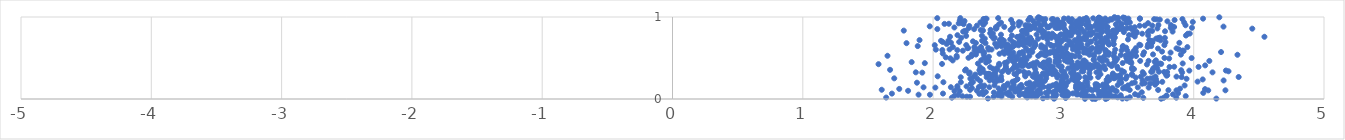
| Category | Series 0 |
|---|---|
| 2.0127929077230045 | 0.657 |
| 2.9386549026233486 | 0.936 |
| 3.026079686418259 | 0.651 |
| 2.9523061924115086 | 0.284 |
| 3.2092926473187156 | 0.783 |
| 1.8354660817791066 | 0.45 |
| 2.9609176681823945 | 0.935 |
| 2.523331696348404 | 0.643 |
| 3.7957012960414556 | 0.329 |
| 3.2008311019266666 | 0.862 |
| 3.321542800486911 | 0.907 |
| 3.152049557840236 | 0.375 |
| 3.308803528072011 | 0.147 |
| 3.482856235314981 | 0.503 |
| 2.524935309373221 | 0.03 |
| 3.172806579868607 | 0.908 |
| 1.6839511220435608 | 0.066 |
| 3.414521443923875 | 0.872 |
| 2.6899993165600997 | 0.81 |
| 3.8800163318312615 | 0.07 |
| 3.1773178096635366 | 0.757 |
| 3.057206967437389 | 0.948 |
| 3.139957605715839 | 0.337 |
| 2.797200789410815 | 0.271 |
| 3.8949638027954285 | 0.126 |
| 3.715497859279122 | 0.971 |
| 3.3870159785690137 | 0.835 |
| 3.3263404394778444 | 0.543 |
| 3.225321784833388 | 0.035 |
| 4.120011501042579 | 0.464 |
| 3.01048862924758 | 0.473 |
| 2.9903450313468576 | 0.051 |
| 3.094933547255815 | 0.905 |
| 2.612727014641468 | 0.875 |
| 3.0945533523039144 | 0.63 |
| 3.4783368550916207 | 0.529 |
| 3.8059823671989417 | 0.108 |
| 3.1302967791101044 | 0.42 |
| 2.83079885424495 | 0.407 |
| 3.178796313748708 | 0.102 |
| 3.8144703713044783 | 0.39 |
| 3.436164389074875 | 0.855 |
| 2.8607818862976644 | 0.629 |
| 3.8116525619852593 | 0.494 |
| 2.7310470094807657 | 0.962 |
| 3.0073635838078037 | 0.51 |
| 2.6093645686440805 | 0.211 |
| 3.624181347336291 | 0.896 |
| 2.5824134226299273 | 0.082 |
| 3.230335264854377 | 0.39 |
| 2.750154674530581 | 0.101 |
| 2.514383526284392 | 0.678 |
| 4.335910965760808 | 0.539 |
| 2.4819055617339045 | 0.858 |
| 3.7292416268291126 | 0.902 |
| 3.115540294431222 | 0.567 |
| 3.9386344331656993 | 0.035 |
| 3.7729351694642426 | 0.329 |
| 2.5801678002385597 | 0.049 |
| 3.124640808166241 | 0.973 |
| 3.417825649316733 | 0.37 |
| 3.9303543962726937 | 0.165 |
| 3.097894585749092 | 0.402 |
| 2.547732741983034 | 0.669 |
| 2.9905952469985415 | 0.141 |
| 2.9578361485748563 | 0.587 |
| 2.276204821079821 | 0.31 |
| 3.849816846805129 | 0.878 |
| 2.75316541027573 | 0.42 |
| 2.9193610782327206 | 0.167 |
| 2.966867575355259 | 0.459 |
| 3.5827959985270033 | 0.662 |
| 3.915584397637178 | 0.434 |
| 3.1328048959891106 | 0.143 |
| 3.7051093437399327 | 0.393 |
| 2.437555538804054 | 0.388 |
| 2.776435331257525 | 0.39 |
| 2.373103196045608 | 0.602 |
| 2.772438722104821 | 0.626 |
| 2.7390426755153454 | 0.895 |
| 3.3219617831241153 | 0.098 |
| 2.1298942536922674 | 0.759 |
| 4.073540130124088 | 0.074 |
| 3.650527387963572 | 0.777 |
| 3.325301494832162 | 0.162 |
| 3.6829255787204356 | 0.694 |
| 2.5038251079841833 | 0.909 |
| 3.6809196208521047 | 0.709 |
| 3.4430559051152865 | 0.863 |
| 3.2817767411909426 | 0.696 |
| 3.4136919969418407 | 0.838 |
| 3.3748205256918746 | 0.779 |
| 2.318443214542111 | 0.591 |
| 2.990975592631945 | 0.529 |
| 4.449636932147669 | 0.858 |
| 2.3439422177804716 | 0.432 |
| 2.336398540622145 | 0.101 |
| 2.5853935785752586 | 0.58 |
| 2.9840735646736807 | 0.715 |
| 3.088935112284073 | 0.521 |
| 3.525956571252985 | 0.304 |
| 2.4645556543721967 | 0.736 |
| 2.7704871718040156 | 0.892 |
| 4.209925339874239 | 0.573 |
| 3.587232037499757 | 0.983 |
| 3.346783353194071 | 0.563 |
| 2.908990424297952 | 0.649 |
| 3.0680109146148205 | 0.854 |
| 2.4111383054961797 | 0.266 |
| 1.8959426762280422 | 0.718 |
| 3.2866052154218592 | 0.841 |
| 3.5496077071442067 | 0.058 |
| 2.1442872707979026 | 0.016 |
| 2.5431475554294916 | 0.712 |
| 3.111449752990449 | 0.057 |
| 2.624904195608859 | 0.472 |
| 3.4427496961653663 | 0.898 |
| 2.7465282629372068 | 0.132 |
| 2.8506955902441677 | 0.945 |
| 3.084228156184976 | 0.298 |
| 2.948341575659798 | 0.664 |
| 2.809568952761372 | 0.997 |
| 3.1997193731167126 | 0.315 |
| 3.4576417435465614 | 0.646 |
| 2.5987994547145945 | 0.964 |
| 3.337718125213804 | 0.01 |
| 2.6488226582971626 | 0.12 |
| 2.984262205377161 | 0.177 |
| 3.163266362373824 | 0.067 |
| 3.1085816823527512 | 0.577 |
| 3.3860788879489014 | 0.669 |
| 2.7759575218620354 | 0.403 |
| 2.802271876086898 | 0.985 |
| 2.4724084441765957 | 0.747 |
| 2.551163462546312 | 0.441 |
| 2.1999503251045587 | 0.696 |
| 2.6947066050959245 | 0.828 |
| 3.1187962037230763 | 0.876 |
| 3.5169491569714193 | 0.457 |
| 3.0177214164501387 | 0.615 |
| 3.483852626853445 | 0.925 |
| 3.72124730576842 | 0.86 |
| 2.186195852542439 | 0.157 |
| 3.1370544152193376 | 0.854 |
| 3.0646731666563314 | 0.239 |
| 3.5749261166274433 | 0.045 |
| 3.0191123386543697 | 0.483 |
| 2.864138078507911 | 0.075 |
| 2.5214700671083663 | 0.09 |
| 3.232382956195235 | 0.54 |
| 2.7666408291746456 | 0.415 |
| 2.7421045410981315 | 0.988 |
| 2.857371253165193 | 0.22 |
| 3.206793129237009 | 0.699 |
| 3.0758721452912847 | 0.854 |
| 2.543179756033295 | 0.158 |
| 3.298303554134542 | 0.886 |
| 3.1286615151663804 | 0.647 |
| 2.9549793692555304 | 0.156 |
| 3.903886722866801 | 0.351 |
| 2.118045623164625 | 0.713 |
| 2.486410413512489 | 0.862 |
| 2.7130883881573444 | 0.618 |
| 3.2696622634810915 | 0.158 |
| 3.163113034054918 | 0.739 |
| 2.8179124918425353 | 0.416 |
| 1.9743187294607083 | 0.886 |
| 3.186808481356976 | 0.785 |
| 3.2767447612846814 | 0.343 |
| 2.9043816229818824 | 0.35 |
| 2.819020783335547 | 0.271 |
| 3.555470802283694 | 0.262 |
| 2.948227243366488 | 0.29 |
| 2.216972874146818 | 0.927 |
| 3.8679365572155 | 0.273 |
| 3.185349569096965 | 0.662 |
| 2.2254453726112113 | 0.034 |
| 3.688104641636912 | 0.254 |
| 3.70651650110273 | 0.274 |
| 2.546151076587128 | 0.879 |
| 3.255750108166336 | 0.679 |
| 3.1768200052466575 | 0.223 |
| 2.5266706327416713 | 0.057 |
| 3.3465414326226 | 0.066 |
| 3.710296594043629 | 0.472 |
| 2.1210712404328946 | 0.917 |
| 2.4664036274410353 | 0.079 |
| 2.060589426664416 | 0.709 |
| 3.394139208001052 | 0.488 |
| 3.0346928113827127 | 0.208 |
| 3.6014986766673265 | 0.082 |
| 2.5772772823682164 | 0.33 |
| 2.5640395092451578 | 0.626 |
| 3.331077139098875 | 0.47 |
| 3.750815240709075 | 0.428 |
| 3.052873782343643 | 0.463 |
| 2.3384461395236604 | 0.248 |
| 4.144330916466578 | 0.325 |
| 3.296945208541073 | 0.091 |
| 2.256885622956997 | 0.154 |
| 3.549375441151162 | 0.813 |
| 2.592279949825529 | 0.052 |
| 2.9228912664015287 | 0.973 |
| 2.421102454312203 | 0.306 |
| 3.169728686349656 | 0.211 |
| 3.2743492887693186 | 0.991 |
| 3.3164222308261255 | 0.107 |
| 3.1914040421138576 | 0.94 |
| 2.692277204940277 | 0.66 |
| 2.753459849790775 | 0.052 |
| 2.961550670194348 | 0.517 |
| 3.273107297637357 | 0.99 |
| 2.181448860523997 | 0.508 |
| 2.6471531380957805 | 0.503 |
| 2.3675722730772253 | 0.635 |
| 3.780010873763055 | 0.826 |
| 2.6826090514608234 | 0.83 |
| 3.0072476218341953 | 0.307 |
| 3.1273829508704116 | 0.95 |
| 2.7637241338848915 | 0.28 |
| 3.5608921447741744 | 0.805 |
| 2.6678640870718344 | 0.767 |
| 2.718122514723904 | 0.793 |
| 2.2408498271952033 | 0.951 |
| 2.823005999444976 | 0.241 |
| 3.343295815826587 | 0.267 |
| 3.396100458934219 | 0.032 |
| 2.945121752698019 | 0.307 |
| 3.262181935147452 | 0.421 |
| 2.674487320446233 | 0.477 |
| 3.311408160281671 | 0.401 |
| 3.0526546459074053 | 0.496 |
| 3.654471430370648 | 0.139 |
| 3.64982651727801 | 0.925 |
| 2.9488491814708495 | 0.571 |
| 3.0003155005260576 | 0.195 |
| 3.0031670624442843 | 0.866 |
| 3.458689768763106 | 0.994 |
| 2.923135163023625 | 0.646 |
| 4.1737684070313295 | 0.005 |
| 2.9613248323263783 | 0.408 |
| 2.2858447701094704 | 0.248 |
| 3.3045605704994947 | 0.684 |
| 3.1863693972440124 | 0.408 |
| 2.385596503188129 | 0.904 |
| 3.1583039040888203 | 0.386 |
| 2.953694893958948 | 0.966 |
| 2.4046528597347114 | 0.085 |
| 2.5386912462027262 | 0.578 |
| 2.5578045955280295 | 0.652 |
| 2.0789821410470712 | 0.205 |
| 3.3862707316637937 | 0.256 |
| 2.7920561191705997 | 0.041 |
| 3.124577023779595 | 0.515 |
| 2.482939417000464 | 0.878 |
| 2.5213016435238087 | 0.93 |
| 2.1967099803855126 | 0.923 |
| 3.2414122934398053 | 0.893 |
| 2.6300995644021814 | 0.658 |
| 3.2449054124700623 | 0 |
| 2.970307508201211 | 0.772 |
| 2.66457989815444 | 0.414 |
| 2.9341399444495786 | 0.766 |
| 2.521997106959918 | 0.272 |
| 3.2057716834680976 | 0.607 |
| 2.949256120214218 | 0.927 |
| 3.1006147604244507 | 0.056 |
| 3.267392329500413 | 0.629 |
| 2.74728295077432 | 0.409 |
| 3.608661051088799 | 0.327 |
| 2.9191350299597296 | 0.021 |
| 2.968042410274518 | 0.867 |
| 2.7867976125775478 | 0.914 |
| 2.849600466831415 | 0.541 |
| 3.4434190134337523 | 0.197 |
| 2.8295265587509704 | 0.629 |
| 2.2159588515341286 | 0.745 |
| 2.8431860380753995 | 0.754 |
| 2.9187993506487757 | 0.395 |
| 2.8824178090397377 | 0.875 |
| 3.1605486211583687 | 0.812 |
| 2.151762731258145 | 0.634 |
| 2.661642037982349 | 0.075 |
| 2.708303988765164 | 0.899 |
| 3.1033141145153187 | 0.379 |
| 3.4857947459884104 | 0.128 |
| 3.4956052343981003 | 0.932 |
| 2.3403267525057037 | 0.606 |
| 3.1666183911834254 | 0.426 |
| 3.0566167969575613 | 0.661 |
| 2.717101152875789 | 0.898 |
| 3.0855297717243735 | 0.271 |
| 3.2639427461651067 | 0.391 |
| 3.741974392391267 | 0.433 |
| 2.5072047850789256 | 0.414 |
| 2.6008431111020474 | 0.137 |
| 3.3875825616984616 | 0.44 |
| 2.9389054600651354 | 0.172 |
| 3.086255688504875 | 0.856 |
| 3.7970259646544497 | 0.291 |
| 2.559852776677844 | 0.388 |
| 3.901772465324058 | 0.541 |
| 2.5209323231679464 | 0.784 |
| 3.321506661417009 | 0.599 |
| 3.250355087883633 | 0.156 |
| 2.944737675117386 | 0.184 |
| 3.5413247343839007 | 0.365 |
| 2.6528471306211685 | 0.335 |
| 3.136668336800437 | 0.669 |
| 2.983840849852884 | 0.395 |
| 2.8875362327457683 | 0.435 |
| 2.2716485529472448 | 0.503 |
| 2.6867666589766173 | 0.398 |
| 3.5477712008596503 | 0.762 |
| 2.868237095243524 | 0.253 |
| 3.58553104939901 | 0.894 |
| 2.5022973724292585 | 0.129 |
| 3.9514406204038885 | 0.633 |
| 2.5570717431576835 | 0.412 |
| 3.2322924494769385 | 0.477 |
| 3.495117507781442 | 0.541 |
| 2.9539198979279204 | 0.904 |
| 3.0167842615382052 | 0.163 |
| 3.7399575726751957 | 0.749 |
| 3.2833831039251775 | 0.749 |
| 2.350831992577654 | 0.146 |
| 2.2587233815543977 | 0.028 |
| 3.402161068448231 | 0.811 |
| 3.1166289117228576 | 0.744 |
| 3.223569798387466 | 0.001 |
| 3.778712037953487 | 0.745 |
| 3.546993695451037 | 0.875 |
| 3.167647611362515 | 0.973 |
| 3.659167115370979 | 0.72 |
| 3.1762120834100593 | 0.564 |
| 2.458687878914974 | 0.369 |
| 2.5442452290730175 | 0.133 |
| 3.39953431200723 | 0.811 |
| 2.5289544591818656 | 0.329 |
| 2.9914717888503852 | 0.616 |
| 2.7554052026516542 | 0.033 |
| 2.7662286891522165 | 0.075 |
| 3.1714958676280034 | 0.455 |
| 3.0062836898038334 | 0.332 |
| 3.05657496460518 | 0.514 |
| 2.7624716348026146 | 0.044 |
| 2.869802760268199 | 0.772 |
| 2.810345171957427 | 0.839 |
| 3.508924246041042 | 0.11 |
| 3.9541026978821456 | 0.796 |
| 3.109652863859984 | 0.122 |
| 3.644137489184857 | 0.248 |
| 3.0065007630160534 | 0.186 |
| 3.0397219399204927 | 0.496 |
| 2.6363690656066208 | 0.3 |
| 3.0613393327729383 | 0.875 |
| 2.700229077947753 | 0.511 |
| 2.782046061230694 | 0.685 |
| 2.2438710262378274 | 0.831 |
| 2.707046240068523 | 0.435 |
| 4.111501618910887 | 0.105 |
| 3.298403983222877 | 0.46 |
| 2.979403915435673 | 0.704 |
| 3.0646875268276323 | 0.388 |
| 2.2089327745584124 | 0.987 |
| 3.4647458399094875 | 0.331 |
| 3.003709729734485 | 0.911 |
| 2.426529372849697 | 0.307 |
| 3.6491162496716956 | 0.815 |
| 3.0618652753440085 | 0.455 |
| 2.7709359001747873 | 0.437 |
| 2.9830341053620186 | 0.393 |
| 2.840658474235761 | 0.431 |
| 2.9242199076846545 | 0.062 |
| 2.867590394742508 | 0.291 |
| 2.180708143233186 | 0.527 |
| 2.5775651216045112 | 0.56 |
| 3.397065884884304 | 0.104 |
| 2.822842783410674 | 0.837 |
| 2.5159807882161487 | 0.716 |
| 3.4545739796116917 | 0.438 |
| 3.726619840403992 | 0.743 |
| 2.864181293372151 | 0.529 |
| 2.499346910593715 | 0.987 |
| 3.885786033767651 | 0.606 |
| 2.4785141996300886 | 0.289 |
| 2.2339943326829834 | 0.913 |
| 2.8615736127181273 | 0.974 |
| 2.32292357305135 | 0.298 |
| 2.163294268876893 | 0.872 |
| 2.8143697526629783 | 0.977 |
| 3.9112809740072265 | 0.324 |
| 3.2561898129419706 | 0.939 |
| 3.4168400053253642 | 0.17 |
| 2.795808193650726 | 0.449 |
| 2.978969200600752 | 0.519 |
| 3.2827726211379864 | 0.481 |
| 2.3831059337864913 | 0.835 |
| 2.888491734977266 | 0.095 |
| 2.5759715930793883 | 0.343 |
| 2.9266812652515632 | 0.005 |
| 2.9308140749174423 | 0.77 |
| 2.6376206114171 | 0.484 |
| 2.8253644616689098 | 0.069 |
| 3.0090746981035443 | 0.098 |
| 2.503240612428774 | 0.071 |
| 2.5723972287911447 | 0.664 |
| 3.027905539067989 | 0.558 |
| 3.8663338689515148 | 0.016 |
| 2.492062293967322 | 0.656 |
| 2.305333139642427 | 0.206 |
| 2.097203609658608 | 0.508 |
| 4.228601992504904 | 0.883 |
| 3.387750390748772 | 0.792 |
| 2.9497151819320204 | 0.865 |
| 3.3099195297364545 | 0.513 |
| 3.1883710788681867 | 0.383 |
| 3.408001263973766 | 0.281 |
| 2.7309997607200795 | 0.402 |
| 2.6445414037395363 | 0.757 |
| 3.940381017815959 | 0.774 |
| 3.0535661525304434 | 0.774 |
| 3.4954420661320413 | 0.166 |
| 3.2665590390291155 | 0.1 |
| 3.2149423895071942 | 0.406 |
| 3.8533220032743456 | 0.963 |
| 3.3846323829418385 | 0.668 |
| 3.5870911062250874 | 0.978 |
| 2.880242065300338 | 0.079 |
| 3.037246555119453 | 0.373 |
| 3.0656152247824404 | 0.53 |
| 3.3530494794339454 | 0.232 |
| 3.6794025995481423 | 0.686 |
| 2.6973943665387212 | 0.437 |
| 3.4383427921213707 | 0.207 |
| 2.5095632053702697 | 0.552 |
| 3.38920877898999 | 0.789 |
| 2.783363973536088 | 0.653 |
| 3.155788805006405 | 0.821 |
| 3.783159129994744 | 0.692 |
| 3.51747320334346 | 0.508 |
| 3.1020490142346593 | 0.102 |
| 2.7418714822238237 | 0.71 |
| 2.54731705278885 | 0.553 |
| 2.8001838636766547 | 0.103 |
| 3.9134343887498444 | 0.975 |
| 2.9434649315692023 | 0.044 |
| 2.783749140422968 | 0.661 |
| 2.1370223935825585 | 0.686 |
| 2.9283653245298833 | 0.082 |
| 3.154419110159531 | 0.73 |
| 2.9253546590167274 | 0.353 |
| 2.967322355324898 | 0.588 |
| 2.7378761962832456 | 0.409 |
| 2.9859835669737764 | 0.882 |
| 3.3425642428501727 | 0.821 |
| 3.017440974770033 | 0.012 |
| 2.937529405341408 | 0.088 |
| 3.0762378369337067 | 0.403 |
| 2.6227714854387885 | 0.455 |
| 2.5779372601928983 | 0.585 |
| 3.613123386706755 | 0.014 |
| 3.3101364881513207 | 0.063 |
| 2.493782861745595 | 0.359 |
| 2.551198591095449 | 0.362 |
| 3.097946292065238 | 0.697 |
| 3.2215130666645093 | 0.622 |
| 3.38019889963341 | 0.298 |
| 3.5616982821420278 | 0.818 |
| 3.0658531065961565 | 0.973 |
| 2.9570233066856444 | 0.295 |
| 2.212282894561914 | 0.265 |
| 2.9763249771079194 | 0.142 |
| 3.2284965781987482 | 0.984 |
| 3.5449239721228687 | 0.798 |
| 3.0711070723307365 | 0.316 |
| 2.993742329713096 | 0.936 |
| 3.687982997509488 | 0.544 |
| 3.4711368951076778 | 0.144 |
| 2.4663370952685018 | 0.302 |
| 2.9812438823331977 | 0.788 |
| 3.3759408322024265 | 0.133 |
| 2.392526651771151 | 0.506 |
| 2.5036600437024124 | 0.227 |
| 3.382956922249977 | 0.743 |
| 3.6496038133373503 | 0.665 |
| 3.454970618799569 | 0.639 |
| 2.6629238891565095 | 0.564 |
| 3.7256607723072084 | 0.616 |
| 4.243497878230503 | 0.106 |
| 2.857351902818846 | 0.608 |
| 3.6811522852959984 | 0.83 |
| 2.881616033197266 | 0.465 |
| 3.272927124772522 | 0.056 |
| 3.118333289921226 | 0.793 |
| 2.707083513350259 | 0.288 |
| 3.6188952747193333 | 0.57 |
| 1.795990697048529 | 0.681 |
| 2.3464047931220673 | 0.589 |
| 3.5575442438327576 | 0.524 |
| 3.5894640414000856 | 0.464 |
| 2.75380614706161 | 0.721 |
| 4.345048175462095 | 0.268 |
| 3.0263549662378004 | 0.551 |
| 1.774961112304549 | 0.834 |
| 3.3006028688441775 | 0.046 |
| 2.5115886187310084 | 0.718 |
| 3.487044063090043 | 0.276 |
| 2.4639399595202187 | 0.026 |
| 2.620984319375263 | 0.388 |
| 3.000117607444721 | 0.891 |
| 3.284457241754445 | 0.301 |
| 2.855430489327968 | 0.38 |
| 3.0548685339146675 | 0.69 |
| 3.124022189204913 | 0.701 |
| 2.3787788087290758 | 0.086 |
| 2.136412271693898 | 0.144 |
| 2.696954512984936 | 0.331 |
| 3.7569685036010116 | 0.578 |
| 3.3507239560478186 | 0.424 |
| 3.4878024687187836 | 0.954 |
| 2.0319986776556016 | 0.986 |
| 3.200024714951663 | 0.54 |
| 2.4382082960124265 | 0.802 |
| 2.782933027100126 | 0.317 |
| 3.823969517305356 | 0.867 |
| 3.0965934118756766 | 0.163 |
| 2.4338640101520235 | 0.226 |
| 3.3342926561934805 | 0.068 |
| 3.7271686342388115 | 0.73 |
| 3.4084346169744477 | 0.094 |
| 3.479610895642636 | 0.248 |
| 2.6722652675002094 | 0.45 |
| 2.5946246738316967 | 0.842 |
| 3.0561257088633123 | 0.787 |
| 3.159756239509217 | 0.47 |
| 2.5971736238220533 | 0.626 |
| 2.2778391590154135 | 0.89 |
| 2.9676341655793257 | 0.523 |
| 3.225276556905154 | 0.015 |
| 2.937321771147889 | 0.34 |
| 3.012985384785199 | 0.043 |
| 2.3808417188869617 | 0.362 |
| 3.1279943728897037 | 0.424 |
| 3.3029741647909665 | 0.684 |
| 3.282428237643086 | 0.854 |
| 2.737257392436616 | 0.881 |
| 3.645852422954602 | 0.635 |
| 3.284016146048534 | 0.615 |
| 3.0512447650962478 | 0.813 |
| 2.980592852885193 | 0.385 |
| 2.6283309067429173 | 0.09 |
| 2.6655719684912147 | 0.692 |
| 2.6940688210774058 | 0.703 |
| 2.8926659501827943 | 0.474 |
| 3.1051754937390594 | 0.237 |
| 3.1570032292142414 | 0.1 |
| 2.280531501762157 | 0.323 |
| 4.2472815746319625 | 0.347 |
| 3.9161762069480344 | 0.591 |
| 2.884267455866038 | 0.139 |
| 2.5068020623564737 | 0.429 |
| 2.487869749383445 | 0.638 |
| 2.9874297725554357 | 0.277 |
| 3.1641882542380877 | 0.448 |
| 3.070519411979184 | 0.28 |
| 3.27339587753557 | 0.577 |
| 2.768481431675433 | 0.95 |
| 3.083958063523187 | 0.82 |
| 1.8821038904890461 | 0.645 |
| 2.8876249802808776 | 0.451 |
| 3.6690811256761826 | 0.251 |
| 3.3011737630500098 | 0.823 |
| 2.643895431265762 | 0.237 |
| 2.5674993877829873 | 0.45 |
| 2.914446458568048 | 0.304 |
| 2.7228086182086724 | 0.019 |
| 2.0685240572372945 | 0.428 |
| 2.7914201223880064 | 0.065 |
| 2.8227570037071157 | 0.217 |
| 2.7768476097810146 | 0.185 |
| 3.0399153118930093 | 0.453 |
| 3.6821052118327415 | 0.895 |
| 2.9014957924044125 | 0.154 |
| 2.715516589269949 | 0.076 |
| 2.185688339869565 | 0.596 |
| 2.396774194133212 | 0.736 |
| 3.079551455210067 | 0.839 |
| 3.148167207380357 | 0.739 |
| 2.898988201688149 | 0.572 |
| 3.295879119366409 | 0.647 |
| 3.144024015416608 | 0.173 |
| 3.104085947634744 | 0.941 |
| 2.428339742511751 | 0.515 |
| 2.2451445086650184 | 0.348 |
| 3.2536619441234396 | 0.325 |
| 3.3397292762299933 | 0.878 |
| 2.3034204532678877 | 0.264 |
| 3.1753968771305825 | 0.722 |
| 2.2840958730169754 | 0.111 |
| 2.399617602279345 | 0.929 |
| 3.744747861141043 | 0.715 |
| 2.531997504539411 | 0.722 |
| 3.2671954249383246 | 0.268 |
| 3.459946871830477 | 0.626 |
| 3.153095924631337 | 0.338 |
| 3.5710711939731956 | 0.142 |
| 2.9984401737425324 | 0.052 |
| 3.9930075701985546 | 0.939 |
| 3.1523412324880518 | 0.463 |
| 3.353381917854972 | 0.077 |
| 2.4981728708974664 | 0.045 |
| 3.487824150798016 | 0.467 |
| 3.525767928699868 | 0.532 |
| 2.8943348645924627 | 0.402 |
| 3.1779932562587336 | 0.96 |
| 1.6698294187475047 | 0.356 |
| 3.378279909681203 | 0.117 |
| 3.6957777717439098 | 0.195 |
| 2.4711132688450923 | 0.167 |
| 2.361482232052957 | 0.219 |
| 3.0139796380918993 | 0.61 |
| 2.9666812913943095 | 0.671 |
| 3.4702548796898727 | 0.973 |
| 3.2464867297098676 | 0.428 |
| 3.4060655425221413 | 0.266 |
| 3.2774790604523516 | 0.497 |
| 3.8225491862465772 | 0.566 |
| 2.9950075116606953 | 0.561 |
| 3.7982506804302174 | 0.947 |
| 3.4472261663671686 | 0.347 |
| 2.7446594954603816 | 0.852 |
| 2.2046153768233623 | 0.957 |
| 3.038757978786209 | 0.712 |
| 2.790632568973305 | 0.318 |
| 3.61744259670449 | 0.306 |
| 2.4755046689490854 | 0.32 |
| 2.7200041539883983 | 0.827 |
| 2.163863694276886 | 0.039 |
| 1.6500660142749846 | 0.527 |
| 3.3085247808593254 | 0.713 |
| 3.0960668957765085 | 0.137 |
| 2.805758095711545 | 0.734 |
| 3.3999928931310026 | 0.988 |
| 3.850245431453393 | 0.394 |
| 4.037312990027408 | 0.391 |
| 2.283360180077101 | 0.027 |
| 3.0378606803814954 | 0.982 |
| 3.2820653546469623 | 0.904 |
| 3.1611275005516752 | 0.613 |
| 2.3840838025137554 | 0.056 |
| 3.114421057473761 | 0.611 |
| 2.569029886248375 | 0.171 |
| 3.3935470125238147 | 0.264 |
| 2.8400845411660485 | 0.797 |
| 2.822628069263563 | 0.542 |
| 3.099993699149061 | 0.946 |
| 2.774297039090437 | 0.896 |
| 2.6914553436431095 | 0.558 |
| 2.967908173372486 | 0.654 |
| 3.15502427957294 | 0.974 |
| 2.989591188003005 | 0.9 |
| 3.146415976604285 | 0.079 |
| 2.96272765754635 | 0.621 |
| 2.7943690738397975 | 0.786 |
| 2.7195673916227827 | 0.115 |
| 3.2446853322323967 | 0.118 |
| 3.299000566890656 | 0.389 |
| 2.4022782524282085 | 0.978 |
| 2.8312413290555116 | 0.168 |
| 2.743097622459938 | 0.669 |
| 2.297953486136638 | 0.132 |
| 2.8273364475185083 | 0.893 |
| 2.9543001903438775 | 0.71 |
| 2.383170364142658 | 0.144 |
| 2.6479997122170715 | 0.244 |
| 3.28727870896949 | 0.98 |
| 3.1221138506610804 | 0.738 |
| 2.720017873208298 | 0.187 |
| 2.93460499732016 | 0.081 |
| 2.8798075256454827 | 0.308 |
| 3.076223495855965 | 0.325 |
| 2.2516902418581766 | 0.36 |
| 2.591882703760572 | 0.728 |
| 3.1163900071322033 | 0.422 |
| 2.5903930629143592 | 0.499 |
| 3.0259912580814396 | 0.457 |
| 3.6737467760618436 | 0.331 |
| 3.0267332779663723 | 0.089 |
| 3.9867730861899466 | 0.869 |
| 2.581444348516824 | 0.594 |
| 3.3040912591233016 | 0.949 |
| 2.7411155611444897 | 0.2 |
| 2.807965536465256 | 0.929 |
| 2.3690199810119474 | 0.163 |
| 2.562286388255014 | 0.622 |
| 3.0175340566843047 | 0.285 |
| 3.2450333259821664 | 0.733 |
| 3.527154168693805 | 0.381 |
| 2.688865387645959 | 0.458 |
| 3.33984663428389 | 0.812 |
| 2.613339412684076 | 0.639 |
| 1.6399523619600431 | 0.018 |
| 3.6595425088629288 | 0.833 |
| 3.1750626103577644 | 0.044 |
| 2.7600685273554837 | 0.162 |
| 2.8238081204917225 | 0.886 |
| 2.8771812055968145 | 0.877 |
| 2.46642876117264 | 0.224 |
| 3.0049059576507986 | 0.786 |
| 2.795277699090296 | 0.032 |
| 2.7384701228503285 | 0.526 |
| 2.9262132137929395 | 0.573 |
| 3.5258999299202163 | 0.192 |
| 2.932743281631782 | 0.009 |
| 2.876687979282061 | 0.725 |
| 3.011252939908429 | 0.741 |
| 3.0616713196969676 | 0.674 |
| 3.5409503979759207 | 0.587 |
| 1.7403182819624694 | 0.123 |
| 3.7200228851708736 | 0.376 |
| 3.175310942415405 | 0.988 |
| 2.2512924064156397 | 0.822 |
| 3.378041582669433 | 0.032 |
| 3.1145228831869214 | 0.138 |
| 3.03403435875634 | 0.041 |
| 2.662662383761762 | 0.708 |
| 3.8681564129517136 | 0.618 |
| 2.985816665605725 | 0.344 |
| 2.3956917058913816 | 0.975 |
| 2.9787762037695913 | 0.107 |
| 2.9083505794317475 | 0.568 |
| 3.1110963394076943 | 0.39 |
| 3.138413395246353 | 0.628 |
| 3.9269881780942844 | 0.933 |
| 3.1155817014266507 | 0.255 |
| 2.6246297059501966 | 0.218 |
| 2.073604486185786 | 0.695 |
| 2.8865426864185895 | 0.152 |
| 3.547780262750802 | 0.2 |
| 2.561185764736051 | 0.069 |
| 2.6694279304037254 | 0.679 |
| 3.1964503425099644 | 0.8 |
| 3.371457842755333 | 0.969 |
| 3.0668063812497737 | 0.654 |
| 3.3293938762738704 | 0.548 |
| 3.3846658766970728 | 0.71 |
| 3.48655152114344 | 0.007 |
| 3.1653901669598863 | 0.002 |
| 2.3719574975956723 | 0.588 |
| 4.029802785881902 | 0.212 |
| 2.3695429373250665 | 0.473 |
| 3.7867574921395977 | 0.303 |
| 2.6359965000947185 | 0.391 |
| 3.0176001919195317 | 0.162 |
| 2.850465455157126 | 0.446 |
| 3.0765787793126376 | 0.331 |
| 3.7688238213303547 | 0.014 |
| 3.5100687635834866 | 0.934 |
| 3.2694989199769715 | 0.989 |
| 3.1014766880196123 | 0.131 |
| 2.858309422033937 | 0.31 |
| 3.267411799750441 | 0.403 |
| 2.2913666697327524 | 0.184 |
| 2.6910187810247255 | 0.063 |
| 3.2217470779480806 | 0.105 |
| 2.192794510519228 | 0.049 |
| 2.450530705139717 | 0.266 |
| 2.603757546476098 | 0.13 |
| 3.937498874330161 | 0.899 |
| 3.086500075607357 | 0.718 |
| 3.2087973501429254 | 0.396 |
| 2.7543493316485828 | 0.72 |
| 3.9696573999450298 | 0.798 |
| 3.265022761024874 | 0.956 |
| 3.907574238669479 | 0.267 |
| 2.627612303405297 | 0.414 |
| 2.5885214130379217 | 0.628 |
| 3.446829953916313 | 0.916 |
| 3.487714918488646 | 0.862 |
| 3.3298769336848935 | 0.727 |
| 3.8261243629892894 | 0.901 |
| 3.696390079809463 | 0.974 |
| 3.1548835857033053 | 0.145 |
| 2.1505033983262316 | 0.47 |
| 2.7352187835982074 | 0.736 |
| 3.2978475040533626 | 0.912 |
| 2.662587324201019 | 0.048 |
| 2.876569776014221 | 0.754 |
| 1.9364261121590944 | 0.437 |
| 4.071969831784111 | 0.98 |
| 3.2287156487545494 | 0.811 |
| 2.1639607913688685 | 0.098 |
| 2.394248260504439 | 0.164 |
| 3.556250664642926 | 0.577 |
| 3.1508900868932437 | 0.363 |
| 2.406799577042965 | 0.444 |
| 2.6934187644825776 | 0.663 |
| 3.6838146806743017 | 0.335 |
| 3.324744192325723 | 0 |
| 2.9864180419814232 | 0.194 |
| 2.2640045225831384 | 0.62 |
| 3.2060516025670047 | 0.59 |
| 2.6117489420638402 | 0.924 |
| 2.780394207939425 | 0.867 |
| 3.3437660230769253 | 0.678 |
| 2.2542474491140476 | 0.658 |
| 2.576965593860111 | 0.645 |
| 2.9492521782231913 | 0.739 |
| 3.3373904394721916 | 0.706 |
| 3.9450944432139745 | 0.247 |
| 3.3404180607143483 | 0.697 |
| 4.087182437558364 | 0.12 |
| 3.2039814411032306 | 0.359 |
| 3.8899463019596983 | 0.685 |
| 3.1111356628188456 | 0.293 |
| 3.441500236546471 | 0.537 |
| 2.987323985808492 | 0.609 |
| 3.1102377267469232 | 0.879 |
| 2.4896010764291736 | 0.247 |
| 3.3354191802542585 | 0.83 |
| 2.908255891520465 | 0.746 |
| 2.604723444733537 | 0.775 |
| 3.1396847466300524 | 0.944 |
| 3.5152661350209238 | 0.553 |
| 2.7613962865507387 | 0.574 |
| 3.073072459174663 | 0.606 |
| 2.883515954356526 | 0.677 |
| 2.6090654193482146 | 0.464 |
| 3.1369893689826243 | 0.047 |
| 3.273798860253224 | 0.02 |
| 3.146648018287293 | 0.428 |
| 3.9226753387133235 | 0.585 |
| 3.16398312353328 | 0.056 |
| 2.9756436285563734 | 0.107 |
| 3.6409913984941635 | 0.421 |
| 2.126261731839823 | 0.605 |
| 2.9817789292872985 | 0.697 |
| 3.0769830032051018 | 0.368 |
| 3.6050989090673307 | 0.186 |
| 3.437155550437505 | 0.294 |
| 3.1036752077858907 | 0.627 |
| 2.6256415385422938 | 0.681 |
| 2.420915921039491 | 0.007 |
| 2.7292600426779035 | 0.584 |
| 2.643798088000486 | 0.401 |
| 2.5725260073512333 | 0.187 |
| 3.2868617594317295 | 0.806 |
| 3.4400663697856335 | 0.046 |
| 3.2581246022862485 | 0.778 |
| 2.8921344115987133 | 0.882 |
| 2.84201895987811 | 0.311 |
| 3.673876596326306 | 0.645 |
| 3.7047320590745416 | 0.174 |
| 3.198898171221479 | 0.417 |
| 2.714942723587333 | 0.311 |
| 2.7463804605391773 | 0.988 |
| 2.9650085579985923 | 0.934 |
| 3.5289142356890237 | 0.289 |
| 3.481761225394429 | 0.626 |
| 2.6621547250901485 | 0.546 |
| 2.7069338903743145 | 0.313 |
| 3.175605583988376 | 0.428 |
| 3.370621851547944 | 0.402 |
| 2.876784310104515 | 0.024 |
| 2.2737691740574304 | 0.865 |
| 2.6613780476847038 | 0.343 |
| 2.2693085343151584 | 0.622 |
| 3.412205173152528 | 0.395 |
| 2.663554161851801 | 0.119 |
| 3.246293059737818 | 0.181 |
| 2.6155262462251128 | 0.567 |
| 3.1507761761914854 | 0.391 |
| 3.1810701097186915 | 0.975 |
| 3.488674479009712 | 0.594 |
| 2.939074033385244 | 0.869 |
| 2.9856164229025905 | 0.395 |
| 2.606251068606084 | 0.636 |
| 2.0743916621383116 | 0.555 |
| 4.542869206778046 | 0.759 |
| 2.2284237937963987 | 0.589 |
| 3.966435159890756 | 0.346 |
| 2.7101973701153366 | 0.85 |
| 2.743549744597669 | 0.14 |
| 3.0019033997747657 | 0.534 |
| 3.175994264875347 | 0.6 |
| 3.7905088106819855 | 0.039 |
| 2.476417039913494 | 0.674 |
| 3.402538031880453 | 0.912 |
| 2.5700532738093416 | 0.574 |
| 2.296565949553434 | 0.543 |
| 3.443952667765674 | 0.244 |
| 3.3337251905983325 | 0.155 |
| 2.7642130700587138 | 0.149 |
| 2.656584798490311 | 0.654 |
| 2.8804561353880436 | 0.418 |
| 2.9082856053970834 | 0.902 |
| 3.7331732071721566 | 0.332 |
| 2.3163667013171994 | 0.632 |
| 2.9853110064108805 | 0.22 |
| 2.5135718678965864 | 0.718 |
| 3.115151994276248 | 0.919 |
| 2.8648243076363378 | 0.588 |
| 3.4311043098270484 | 0.217 |
| 3.5944069124265603 | 0.273 |
| 2.1862926921098293 | 0.139 |
| 4.088069258450787 | 0.41 |
| 2.7973529326873945 | 0.23 |
| 2.597501026153685 | 0.513 |
| 2.982495208380591 | 0.157 |
| 3.514252960547381 | 0.869 |
| 2.8198293943762063 | 0.116 |
| 3.749874613859677 | 0.003 |
| 2.2920497290056323 | 0.189 |
| 3.0673420701410787 | 0.917 |
| 3.3787276504560566 | 0.832 |
| 2.7729663340932964 | 0.268 |
| 3.5294390346483455 | 0.785 |
| 2.9328255439813686 | 0.937 |
| 2.3148532196247054 | 0.852 |
| 3.1232973577749426 | 0.922 |
| 3.4595241354895157 | 0.858 |
| 2.8488599649247996 | 0.384 |
| 3.416139653300564 | 0.021 |
| 3.70074621859883 | 0.453 |
| 3.00484545460178 | 0.982 |
| 3.555650453102422 | 0.62 |
| 3.3952035647548735 | 0.75 |
| 2.6071955250356202 | 0.027 |
| 3.1251076207772583 | 0.404 |
| 2.204227873349046 | 0.095 |
| 3.3800291003544918 | 0.311 |
| 2.7233404862728294 | 0.686 |
| 2.9419586814416645 | 0.514 |
| 3.035317204975417 | 0.777 |
| 3.283616401746099 | 0.762 |
| 2.736604510272734 | 0.061 |
| 3.3040743949453772 | 0.177 |
| 3.710726066972837 | 0.242 |
| 2.80088272029045 | 0.052 |
| 2.824617740689751 | 0.263 |
| 2.9386941362860943 | 0.448 |
| 3.7749471569875013 | 0.657 |
| 3.2072868650464397 | 0.259 |
| 2.8318068778661574 | 0.559 |
| 3.758907744268236 | 0.209 |
| 3.4526194876892964 | 0.005 |
| 3.0582103144548656 | 0.319 |
| 2.920361002775661 | 0.969 |
| 2.362377560164134 | 0.386 |
| 3.331751374306464 | 0.235 |
| 3.3498137673231714 | 0.663 |
| 3.389860328276807 | 0.252 |
| 3.791796986278521 | 0.284 |
| 3.5095040875797796 | 0.021 |
| 3.148725067788726 | 0.121 |
| 1.975669264927292 | 0.052 |
| 2.607216326465315 | 0.361 |
| 3.6075117748682826 | 0.227 |
| 3.196220186151814 | 0.032 |
| 2.959953222809823 | 0.496 |
| 2.7107754369803283 | 0.722 |
| 3.2963460176419987 | 0.629 |
| 2.6222867622141495 | 0.133 |
| 3.321161600564184 | 0.982 |
| 2.380974083137935 | 0.707 |
| 2.526102907459605 | 0.728 |
| 2.4485357630028357 | 0.603 |
| 2.613485013997357 | 0.693 |
| 3.0146328093949775 | 0.834 |
| 2.3057078187352573 | 0.703 |
| 3.5217503654985 | 0.439 |
| 2.3746424086899367 | 0.772 |
| 4.267083980242324 | 0.338 |
| 2.687761313574854 | 0.755 |
| 2.087632100697801 | 0.916 |
| 3.348970236431308 | 0.763 |
| 2.3865521278512807 | 0.976 |
| 2.3928882932572293 | 0.568 |
| 3.7757084179375076 | 0.5 |
| 2.60426976504686 | 0.524 |
| 3.348806029043878 | 0.782 |
| 3.71862095151655 | 0.201 |
| 2.783464426785263 | 0.03 |
| 2.658208088392461 | 0.936 |
| 3.1051441590173856 | 0.583 |
| 2.6943285718661576 | 0.692 |
| 3.391724562339103 | 0.998 |
| 2.4774580897045286 | 0.206 |
| 2.4326017893397585 | 0.306 |
| 2.361516439657782 | 0.317 |
| 2.9285407987404986 | 0.589 |
| 2.0759184031061557 | 0.066 |
| 3.1854873904857675 | 0.861 |
| 3.329634799141122 | 0.96 |
| 3.114138464997378 | 0.815 |
| 3.275993199985175 | 0.385 |
| 3.3792499202735153 | 0.291 |
| 2.6327018724631954 | 0.517 |
| 3.3218871986011305 | 0.584 |
| 3.259124315297873 | 0.846 |
| 3.320277548043003 | 0.365 |
| 2.707874743139397 | 0.277 |
| 2.5212237456017896 | 0.24 |
| 3.4642128742896183 | 0.816 |
| 3.3443436714810186 | 0.953 |
| 1.9266109374515064 | 0.142 |
| 3.4010098146879106 | 0.463 |
| 2.9352592027325173 | 0.035 |
| 1.8080396275842587 | 0.1 |
| 3.206180467108404 | 0.116 |
| 2.1036522413591796 | 0.672 |
| 2.0172714024555045 | 0.139 |
| 3.6842852005772118 | 0.354 |
| 2.9410973385014807 | 0.062 |
| 3.624314316799009 | 0.191 |
| 3.109541516696708 | 0.445 |
| 2.774970143541781 | 0.153 |
| 3.2197419193021086 | 0.397 |
| 3.8406381722160465 | 0.056 |
| 2.3358040092661403 | 0.895 |
| 2.7175153483805667 | 0.481 |
| 3.423210507609972 | 0.947 |
| 2.7098225309247606 | 0.422 |
| 3.4990335269891064 | 0.98 |
| 3.1850136818168875 | 0.16 |
| 3.054767903030749 | 0.53 |
| 2.89189654208924 | 0.558 |
| 3.0586638425086705 | 0.775 |
| 3.2018342186284197 | 0.891 |
| 3.0087524699661268 | 0.122 |
| 2.7614966583991554 | 0.127 |
| 2.942810395543998 | 0.474 |
| 2.5251423067374903 | 0.229 |
| 2.3280748724233167 | 0.683 |
| 3.3897371413558615 | 0.562 |
| 3.0534477674072535 | 0.509 |
| 3.2533732714553736 | 0.577 |
| 2.4278086305659063 | 0.463 |
| 2.9651138761097795 | 0.506 |
| 3.1636531199373907 | 0.029 |
| 2.2305596311208005 | 0.821 |
| 2.7533073421891934 | 0.596 |
| 2.8411457052174303 | 0.974 |
| 3.157075923384066 | 0.567 |
| 3.220053871273424 | 0.805 |
| 3.214210552697831 | 0.799 |
| 2.9532359704402236 | 0.261 |
| 2.329055510589883 | 0.542 |
| 3.1669347625017616 | 0.265 |
| 2.901155517980336 | 0.358 |
| 3.255142748303901 | 0.616 |
| 3.495865840156331 | 0.726 |
| 3.0683224010778076 | 0.417 |
| 3.507857021240469 | 0.453 |
| 3.4195342431149958 | 0.99 |
| 3.326576807727944 | 0.587 |
| 2.9115070270745615 | 0.973 |
| 3.0310344528551787 | 0.794 |
| 3.4468510152544742 | 0.593 |
| 1.9168548841035613 | 0.321 |
| 2.617989665804967 | 0.176 |
| 4.229537598189758 | 0.226 |
| 3.265206710824511 | 0.896 |
| 3.1554865642802707 | 0.087 |
| 2.7722488805538266 | 0.421 |
| 2.035209732503385 | 0.277 |
| 3.7269098199874935 | 0.11 |
| 2.4590279813046307 | 0.799 |
| 3.1695493999407596 | 0.773 |
| 2.9956746365432423 | 0.236 |
| 2.8477869204165063 | 0.149 |
| 2.3771133502640955 | 0.713 |
| 3.2344140858124613 | 0.522 |
| 2.986041532106832 | 0.928 |
| 1.581211850672553 | 0.425 |
| 1.8884766068914496 | 0.053 |
| 3.4134483829465965 | 0.491 |
| 2.784411637295146 | 0.364 |
| 3.3975916704893154 | 0.603 |
| 2.4491644151586187 | 0.766 |
| 3.2109585896256188 | 0.869 |
| 3.0418666359072204 | 0.067 |
| 2.914785788212376 | 0.797 |
| 4.069020047692804 | 0.239 |
| 2.3551329839714326 | 0.351 |
| 3.100841329370379 | 0.652 |
| 3.089007274349049 | 0.222 |
| 2.431944888695118 | 0.143 |
| 2.3630174479122563 | 0.935 |
| 3.7214361007923804 | 0.428 |
| 3.360077898653482 | 0.973 |
| 2.744949823442245 | 0.749 |
| 2.8364838286149388 | 0.205 |
| 2.952049060422244 | 0.742 |
| 2.8307891000529493 | 0.655 |
| 2.427739055344631 | 0.602 |
| 2.070513029032641 | 0.598 |
| 2.3818412583811837 | 0.337 |
| 3.2582325979159585 | 0.178 |
| 2.415944920337834 | 0.292 |
| 2.253736016049819 | 0.769 |
| 3.0077069543923134 | 0.727 |
| 2.686689319428092 | 0.573 |
| 3.6047947302859673 | 0.796 |
| 2.03250926350146 | 0.853 |
| 3.527043549047777 | 0.364 |
| 3.0146452564848247 | 0.743 |
| 2.2129712517001847 | 0.205 |
| 3.2738766720940706 | 0.925 |
| 3.3862851690860443 | 0.524 |
| 3.4581719749505266 | 0.13 |
| 2.8613251047962 | 0.287 |
| 2.4023565703023717 | 0.682 |
| 1.6057543845283953 | 0.113 |
| 3.6654458941566204 | 0.188 |
| 3.791734626595848 | 0.041 |
| 3.110998586326381 | 0.652 |
| 3.213420501534269 | 0.7 |
| 2.91018468556943 | 0.385 |
| 2.6830475335987227 | 0.143 |
| 2.7510568011368344 | 0.86 |
| 2.1869485512803815 | 0.778 |
| 3.1440344765428887 | 0.624 |
| 2.5469420470342654 | 0.124 |
| 3.590661890524608 | 0.656 |
| 2.6566401533940103 | 0.896 |
| 2.671081039363307 | 0.932 |
| 3.3468510618902383 | 0.539 |
| 3.4712273527086466 | 0.989 |
| 2.4041585064632436 | 0.494 |
| 3.1213176187538143 | 0.267 |
| 2.365925378086606 | 0.841 |
| 2.9212210647786137 | 0.083 |
| 3.5277320289691314 | 0.849 |
| 3.117932912789585 | 0.19 |
| 2.4228566294552762 | 0.623 |
| 2.8070484575958483 | 0.525 |
| 2.949628438946178 | 0.124 |
| 3.2968987662876077 | 0.865 |
| 2.294952173172632 | 0.522 |
| 2.7088577756410843 | 0.04 |
| 3.6115945912012903 | 0.541 |
| 2.8368924387111107 | 0.838 |
| 2.388849153334485 | 0.541 |
| 3.1386120764458694 | 0.916 |
| 2.8059543783724554 | 0.173 |
| 3.322670150589473 | 0.027 |
| 3.0101772560732054 | 0.541 |
| 3.2495411030667705 | 0.167 |
| 3.5037048550083814 | 0.779 |
| 3.3353554611419227 | 0.14 |
| 2.441410983586734 | 0.844 |
| 2.8437781330185654 | 0.633 |
| 2.8158566251111985 | 0.068 |
| 2.3553196469176596 | 0.063 |
| 3.334563917924556 | 0.86 |
| 3.5241850520074736 | 0.861 |
| 3.3639245840472896 | 0.035 |
| 2.904508442951432 | 0.658 |
| 2.856359170395225 | 0.914 |
| 2.750327684269376 | 0.417 |
| 3.0030483220797697 | 0.288 |
| 3.1840562912554184 | 0.2 |
| 2.8537392502622385 | 0.818 |
| 2.8205119309077267 | 0.988 |
| 3.3245446469058413 | 0.746 |
| 3.867641204008152 | 0.106 |
| 3.334383464948606 | 0.207 |
| 3.7157090952574356 | 0.424 |
| 2.9307640575494966 | 0.922 |
| 3.2953064385515503 | 0.491 |
| 3.3614653751576475 | 0.109 |
| 4.196743212391545 | 0.996 |
| 2.6610776892874424 | 0.151 |
| 3.2339953512396367 | 0.479 |
| 2.843185307322918 | 0.008 |
| 3.9839841053363285 | 0.499 |
| 3.7399084827825977 | 0.968 |
| 2.6762185834668015 | 0.172 |
| 2.0212751237016433 | 0.602 |
| 1.8761036785697267 | 0.199 |
| 3.1101560743985184 | 0.171 |
| 3.022180635399235 | 0.266 |
| 3.6901156320924726 | 0.374 |
| 1.7018168585916709 | 0.252 |
| 3.010942303332397 | 0.057 |
| 1.8673918885649181 | 0.325 |
| 3.8380884026583395 | 0.822 |
| 2.9374940529540057 | 0.55 |
| 2.8783944311386254 | 0.35 |
| 2.7341914157481715 | 0.317 |
| 3.6535647856430034 | 0.465 |
| 3.021433119900502 | 0.827 |
| 3.0434643967445107 | 0.951 |
| 2.6536091878006927 | 0.094 |
| 2.4868001583003654 | 0.373 |
| 2.624311739848465 | 0.305 |
| 3.430396442641314 | 0.276 |
| 3.65660673032437 | 0.666 |
| 2.4101154179502484 | 0.979 |
| 2.886656998861174 | 0.793 |
| 3.711910497523367 | 0.736 |
| 3.0723581213702182 | 0.068 |
| 2.1321814877178453 | 0.496 |
| 3.1955988714726633 | 0.264 |
| 2.406337253359767 | 0.309 |